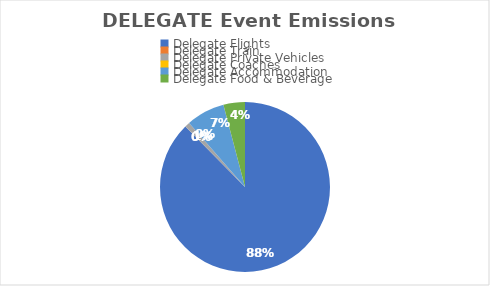
| Category | Series 0 |
|---|---|
| Delegate Flights | 8.36 |
| Delegate Train | 0 |
| Delegate Private Vehicles | 0.09 |
| Delegate Coaches | 0 |
| Delegate Accommodation | 0.7 |
| Delegate Food & Beverage | 0.39 |